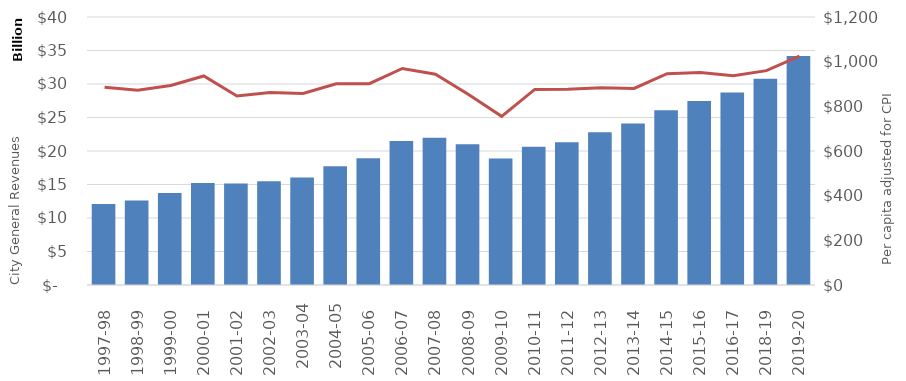
| Category | Series 0 |
|---|---|
|  1997-98  | 12077259200 |
|  1998-99  | 12600597404 |
|  1999-00  | 13749317285 |
|  2000-01  | 15231682378 |
|  2001-02  | 15154296974 |
|  2002-03  | 15501204113 |
| 2003-04 | 16055583142 |
| 2004-05 | 17733493293 |
|  2005-06  | 18921519955 |
|  2006-07  | 21477469869 |
|  2007-08  | 21973273971 |
|  2008-09  | 21013085363 |
|  2009-10  | 18894501966 |
|  2010-11  | 20638119403 |
|  2011-12  | 21324619451 |
|  2012-13  | 22803582432 |
|  2013-14  | 24098264730 |
|  2014-15  | 26099046154 |
|  2015-16  | 27456406870 |
|  2016-17  | 28719589727 |
|  2018-19  | 30767469662 |
|  2019-20  | 34161851428 |